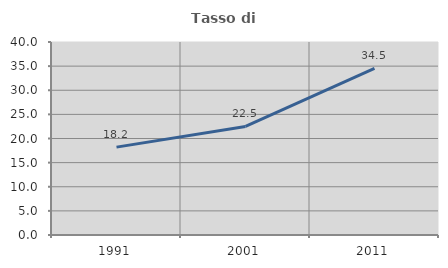
| Category | Tasso di occupazione   |
|---|---|
| 1991.0 | 18.212 |
| 2001.0 | 22.491 |
| 2011.0 | 34.545 |